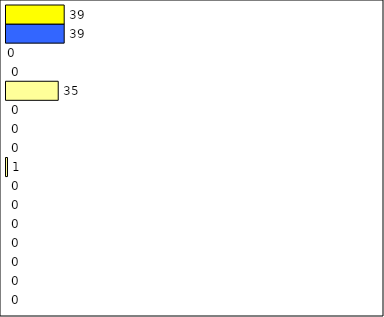
| Category | -2 | -1 | 0 | 1 | 2 | 3 | 4 | 5 | 6 | 7 | 8 | 9 | 10 | 11 | 12 | Perfect Round |
|---|---|---|---|---|---|---|---|---|---|---|---|---|---|---|---|---|
| 0 | 0 | 0 | 0 | 0 | 0 | 0 | 0 | 1 | 0 | 0 | 0 | 35 | 0 | 0 | 39 | 39 |